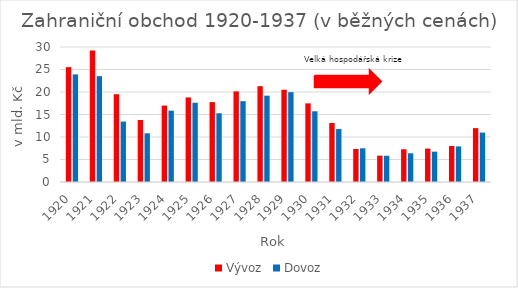
| Category | Vývoz | Dovoz |
|---|---|---|
| 1920.0 | 25525 | 23912 |
| 1921.0 | 29213 | 23524 |
| 1922.0 | 19510 | 13436 |
| 1923.0 | 13782 | 10821 |
| 1924.0 | 16981 | 15855 |
| 1925.0 | 18788 | 17615 |
| 1926.0 | 17755 | 15277 |
| 1927.0 | 20133 | 17960 |
| 1928.0 | 21295 | 19191 |
| 1929.0 | 20497 | 19962 |
| 1930.0 | 17472 | 15712 |
| 1931.0 | 13119 | 11764 |
| 1932.0 | 7343 | 7487 |
| 1933.0 | 5855 | 5831 |
| 1934.0 | 7280 | 6382 |
| 1935.0 | 7418 | 6739 |
| 1936.0 | 8008 | 7909 |
| 1937.0 | 11972 | 10980 |